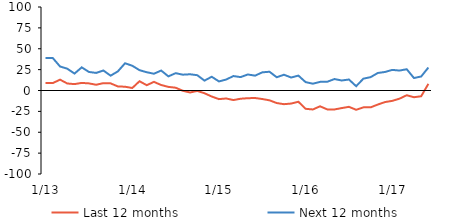
| Category | Last 12 months | Next 12 months |
|---|---|---|
|  1/13 | 8.92 | 38.82 |
|  2/13 | 8.92 | 38.82 |
|  3/13 | 12.98 | 28.75 |
|  4/13 | 8.4 | 26.12 |
|  5/13 | 7.64 | 20.26 |
|  6/13 | 9.1 | 27.71 |
|  7/13 | 8.51 | 22.2 |
|  8/13 | 6.89 | 21.06 |
|  9/13 | 8.81 | 23.95 |
|  10/13 | 8.54 | 17.76 |
|  11/13 | 4.88 | 22.87 |
|  12/13 | 4.53 | 32.62 |
|  1/14 | 2.99 | 29.64 |
|  2/14 | 11.1 | 24.37 |
|  3/14 | 6.35 | 21.86 |
|  4/14 | 10.34 | 20.09 |
|  5/14 | 6.57 | 23.91 |
|  6/14 | 4.33 | 16.91 |
|  7/14 | 3.35 | 20.75 |
|  8/14 | -0.33 | 18.95 |
|  9/14 | -2.37 | 19.44 |
|  10/14 | -0.5 | 18.32 |
|  11/14 | -3.3 | 11.85 |
|  12/14 | -7.21 | 16.46 |
|  1/15 | -10.32 | 10.88 |
|  2/15 | -9.55 | 13.1 |
|  3/15 | -11.45 | 17.32 |
|  4/15 | -9.85 | 16.04 |
|  5/15 | -9.22 | 19.19 |
|  6/15 | -8.99 | 17.77 |
|  7/15 | -10.2 | 21.74 |
|  8/15 | -11.76 | 22.49 |
|  9/15 | -15.03 | 15.86 |
|  10/15 | -16.38 | 18.89 |
|  11/15 | -15.64 | 15.55 |
|  12/15 | -13.49 | 17.84 |
|  1/16 | -21.91 | 10.03 |
|  2/16 | -22.72 | 8.16 |
|  3/16 | -18.91 | 10.34 |
|  4/16 | -22.65 | 10.48 |
|  5/16 | -22.69 | 13.73 |
|  6/16 | -21.05 | 11.99 |
|  7/16 | -19.56 | 13.15 |
|  8/16 | -23.1 | 5.15 |
|  9/16 | -20.21 | 14.17 |
|  10/16 | -20.19 | 16 |
|  11/16 | -16.81 | 20.99 |
|  12/16 | -13.84 | 22.19 |
|  1/17 | -12.4 | 24.7 |
|  2/17 | -9.79 | 23.87 |
|  3/17 | -5.67 | 25.48 |
|  4/17 | -8.04 | 14.94 |
|  5/17 | -6.9 | 16.78 |
|  6/17 | 7.95 | 27.5 |